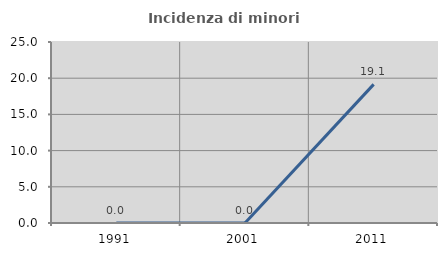
| Category | Incidenza di minori stranieri |
|---|---|
| 1991.0 | 0 |
| 2001.0 | 0 |
| 2011.0 | 19.149 |